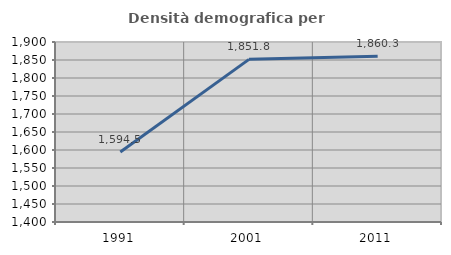
| Category | Densità demografica |
|---|---|
| 1991.0 | 1594.497 |
| 2001.0 | 1851.779 |
| 2011.0 | 1860.283 |